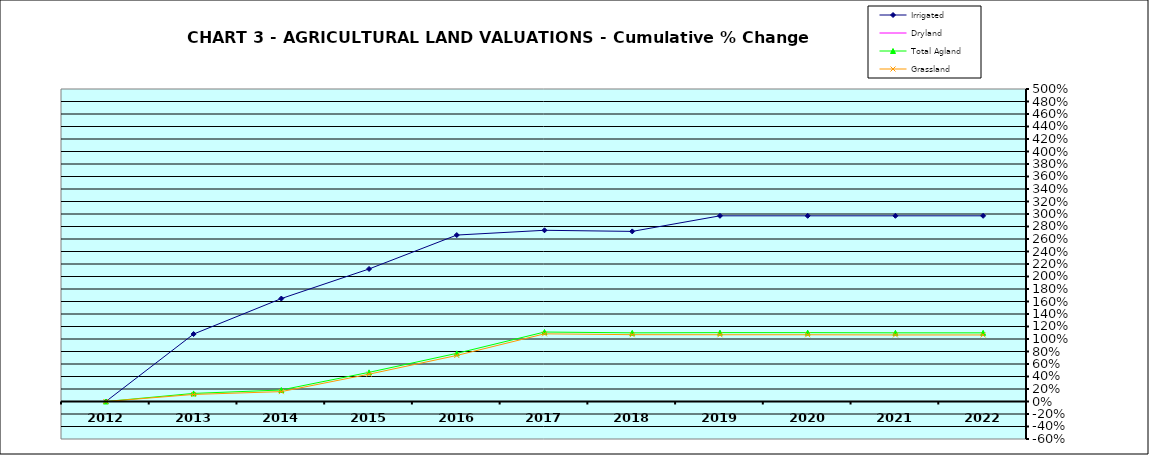
| Category | Irrigated | Dryland | Total Agland | Grassland |
|---|---|---|---|---|
| 2012.0 | 0 | 0 | 0 | 0 |
| 2013.0 | 1.079 | 0 | 0.129 | 0.113 |
| 2014.0 | 1.647 | 0 | 0.184 | 0.158 |
| 2015.0 | 2.121 | 0 | 0.467 | 0.437 |
| 2016.0 | 2.663 | 0 | 0.77 | 0.737 |
| 2017.0 | 2.739 | 0 | 1.112 | 1.083 |
| 2018.0 | 2.722 | 0 | 1.098 | 1.069 |
| 2019.0 | 2.971 | 0 | 1.102 | 1.068 |
| 2020.0 | 2.971 | 0 | 1.102 | 1.068 |
| 2021.0 | 2.971 | 0 | 1.099 | 1.065 |
| 2022.0 | 2.971 | 0 | 1.098 | 1.065 |